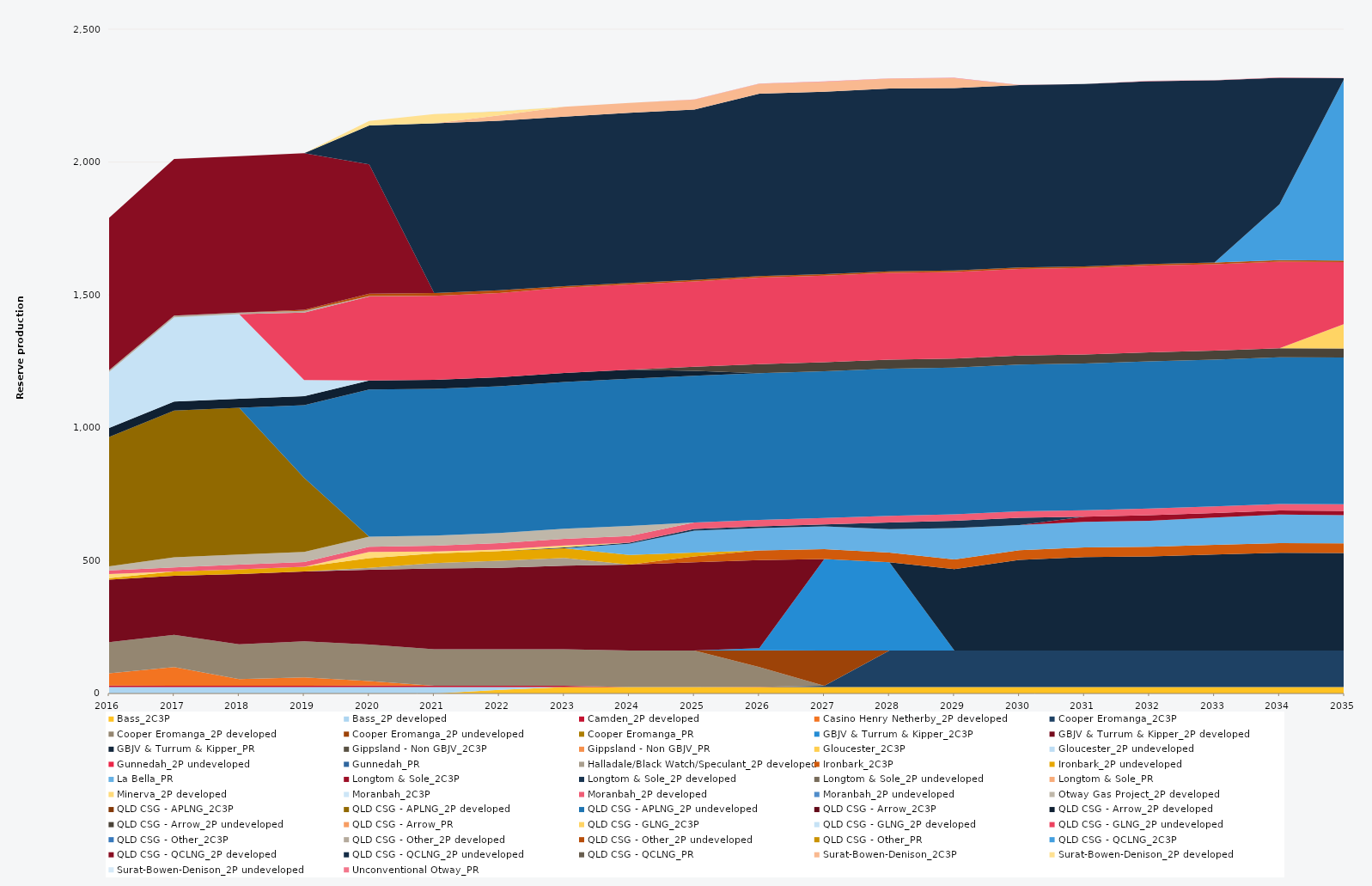
| Category | Bass_2C3P | Bass_2P developed | Camden_2P developed | Casino Henry Netherby_2P developed | Cooper Eromanga_2C3P | Cooper Eromanga_2P developed | Cooper Eromanga_2P undeveloped | Cooper Eromanga_PR | GBJV & Turrum & Kipper_2C3P | GBJV & Turrum & Kipper_2P developed | GBJV & Turrum & Kipper_PR | Gippsland - Non GBJV_2C3P | Gippsland - Non GBJV_PR | Gloucester_2C3P | Gloucester_2P undeveloped | Gunnedah_2P undeveloped | Gunnedah_PR | Halladale/Black Watch/Speculant_2P developed | Ironbark_2C3P | Ironbark_2P undeveloped | La Bella_PR | Longtom & Sole_2C3P | Longtom & Sole_2P developed | Longtom & Sole_2P undeveloped | Longtom & Sole_PR | Minerva_2P developed | Moranbah_2C3P | Moranbah_2P developed | Moranbah_2P undeveloped | Otway Gas Project_2P developed | QLD CSG - APLNG_2C3P | QLD CSG - APLNG_2P developed | QLD CSG - APLNG_2P undeveloped | QLD CSG - Arrow_2C3P | QLD CSG - Arrow_2P developed | QLD CSG - Arrow_2P undeveloped | QLD CSG - Arrow_PR | QLD CSG - GLNG_2C3P | QLD CSG - GLNG_2P developed | QLD CSG - GLNG_2P undeveloped | QLD CSG - Other_2C3P | QLD CSG - Other_2P developed | QLD CSG - Other_2P undeveloped | QLD CSG - Other_PR | QLD CSG - QCLNG_2C3P | QLD CSG - QCLNG_2P developed | QLD CSG - QCLNG_2P undeveloped | QLD CSG - QCLNG_PR | Surat-Bowen-Denison_2C3P | Surat-Bowen-Denison_2P developed | Surat-Bowen-Denison_2P undeveloped | Unconventional Otway_PR |
|---|---|---|---|---|---|---|---|---|---|---|---|---|---|---|---|---|---|---|---|---|---|---|---|---|---|---|---|---|---|---|---|---|---|---|---|---|---|---|---|---|---|---|---|---|---|---|---|---|---|---|---|---|
| 2016 | 0 | 24.522 | 5 | 46.481 | 0 | 117.302 | 0 | 0 | 0 | 235.041 | 0 | 0 | 0 | 0 | 0 | 0 | 0 | 0 | 0 | 5.468 | 0 | 0 | 0 | 0 | 0 | 16 | 0 | 13.144 | 0 | 15.606 | 0 | 486.482 | 0 | 0 | 34.038 | 0 | 0 | 0 | 211.563 | 0 | 0 | 5.856 | 0 | 0 | 0 | 573.742 | 0 | 0 | 0 | 0 | 0 | 0 |
| 2017 | 0 | 24.455 | 5 | 69.931 | 0 | 121.253 | 0 | 0 | 0 | 222.562 | 0 | 0 | 0 | 0 | 0 | 0 | 0 | 0 | 0 | 16.286 | 0 | 0 | 0 | 0 | 0 | 0 | 0 | 14.794 | 0 | 38 | 0 | 552.245 | 0 | 0 | 33.945 | 0 | 0 | 0 | 317.522 | 0 | 0 | 5.84 | 0 | 0 | 0 | 589.569 | 0 | 0 | 0 | 0 | 0 | 0 |
| 2018 | 0 | 24.455 | 5 | 24.61 | 0 | 130.904 | 0 | 0 | 0 | 264.315 | 0 | 0 | 0 | 0 | 0 | 0 | 0 | 0 | 0 | 18.209 | 0 | 0 | 0 | 0 | 0 | 0 | 0 | 17.995 | 0 | 38 | 0 | 552.245 | 0 | 0 | 33.945 | 0 | 0 | 0 | 318.073 | 0 | 0 | 5.84 | 0 | 0 | 0 | 588.744 | 0 | 0 | 0 | 0 | 0 | 0 |
| 2019 | 0 | 24.455 | 5 | 31.568 | 0 | 135.35 | 0 | 0 | 0 | 262.5 | 0 | 0 | 0 | 0 | 0 | 0 | 0 | 0 | 0 | 18.25 | 0 | 0 | 0 | 0 | 0 | 0 | 0 | 18.062 | 0 | 38 | 0 | 278.578 | 273.667 | 0 | 33.945 | 0 | 0 | 0 | 60.142 | 254.295 | 0 | 5.84 | 4.563 | 0 | 0 | 588.948 | 0 | 0 | 0 | 0 | 0 | 0 |
| 2020 | 0 | 24.522 | 5 | 17.669 | 0 | 137.25 | 0 | 0 | 0 | 281.351 | 0 | 0 | 0 | 0 | 0 | 0 | 0 | 6.818 | 0 | 36.6 | 0 | 0 | 0 | 0 | 0 | 23.79 | 0 | 19.632 | 0 | 38 | 0 | 0 | 553.758 | 0 | 34.038 | 0 | 0 | 0 | 0 | 315.784 | 0 | 1.624 | 8.795 | 0 | 0 | 486.398 | 147.06 | 0 | 0 | 16.42 | 0 | 0 |
| 2021 | 0 | 24.455 | 5 | 0 | 0 | 136.875 | 0 | 0 | 0 | 304.277 | 0 | 0 | 0 | 0 | 0 | 0 | 0 | 20.198 | 0 | 36.5 | 0 | 0 | 0 | 0 | 0 | 7.135 | 0 | 22.187 | 0 | 38 | 0 | 0 | 552.245 | 0 | 33.945 | 0 | 0 | 0 | 0 | 315.98 | 0 | 0 | 10.403 | 0 | 0 | 0 | 638.374 | 0 | 0 | 35.153 | 0 | 0 |
| 2022 | 13.672 | 10.783 | 5 | 0 | 0 | 136.875 | 0 | 0 | 0 | 306.648 | 0 | 0 | 0 | 0 | 0 | 0 | 0 | 26.339 | 0 | 36.5 | 0 | 0 | 0 | 0 | 0 | 6.283 | 0 | 24.144 | 0 | 38 | 0 | 0 | 552.245 | 0 | 33.945 | 0 | 0 | 0 | 0 | 316.418 | 0 | 0 | 10.403 | 0 | 0 | 0 | 638.383 | 0 | 19.989 | 15.241 | 2 | 0 |
| 2023 | 24.455 | 0 | 5 | 0 | 0 | 136.875 | 0 | 0 | 0 | 315.098 | 0 | 0 | 0 | 0 | 0 | 0 | 0 | 28.645 | 0 | 36.5 | 0 | 0 | 3.364 | 0 | 0 | 7.541 | 0 | 24.788 | 0 | 38 | 0 | 0 | 552.245 | 0 | 33.945 | 0 | 0 | 0 | 0 | 320.75 | 0 | 0 | 5.84 | 0 | 0 | 0 | 638.041 | 0 | 37.23 | 0 | 0 | 0 |
| 2024 | 24.522 | 0 | 0 | 0 | 0 | 137.25 | 0 | 0 | 0 | 323.245 | 0 | 0 | 0 | 0 | 0 | 0 | 0 | 0 | 0 | 36.6 | 42.142 | 0 | 3.84 | 0 | 0 | 0 | 0 | 24.888 | 0 | 38 | 0 | 0 | 553.758 | 0 | 34.038 | 0 | 0 | 0 | 0 | 321.243 | 0 | 0 | 5.856 | 0 | 0 | 0 | 639.813 | 0 | 37.332 | 0 | 0 | 0 |
| 2025 | 24.455 | 0 | 0 | 0 | 0 | 136.875 | 0 | 0 | 0 | 332.757 | 0 | 0 | 0 | 0 | 0 | 0 | 0 | 0 | 21.413 | 15.087 | 82.203 | 0 | 6.262 | 0 | 0 | 0 | 0 | 24.82 | 0 | 0 | 0 | 0 | 552.245 | 0 | 18.166 | 15.779 | 0 | 0 | 0 | 320.866 | 0 | 0 | 5.84 | 0 | 0 | 0 | 641.133 | 0 | 37.23 | 0 | 0 | 0.854 |
| 2026 | 24.455 | 0 | 1 | 0 | 0 | 74.191 | 62.684 | 0 | 8.223 | 331.313 | 0 | 0 | 0 | 0 | 0 | 0 | 0 | 0 | 36.5 | 0 | 84.04 | 0 | 6.381 | 0 | 0 | 0 | 0 | 24.82 | 0 | 0 | 0 | 0 | 552.245 | 0 | 0 | 33.945 | 0 | 0 | 0 | 325.58 | 0 | 0 | 5.84 | 0 | 0 | 0 | 686.2 | 0 | 37.23 | 0 | 0 | 0.883 |
| 2027 | 24.455 | 0 | 0 | 0 | 4.977 | 0 | 131.898 | 0 | 345.189 | 0 | 0 | 0 | 0 | 0 | 0 | 0 | 0 | 0 | 36.5 | 0 | 86.031 | 0 | 6.937 | 0 | 0 | 0 | 0 | 24.82 | 0 | 0 | 0 | 0 | 552.245 | 0 | 0 | 33.945 | 0 | 0 | 0 | 325.58 | 0 | 0 | 5.84 | 0 | 0 | 0 | 686.2 | 0 | 37.23 | 0 | 0 | 1.497 |
| 2028 | 24.522 | 0 | 0 | 0 | 137.25 | 0 | 0 | 0 | 332.301 | 0 | 0 | 0 | 0 | 0 | 0 | 0 | 0 | 0 | 36.6 | 0 | 88.107 | 0 | 24.931 | 0 | 0 | 0 | 0 | 24.888 | 0 | 0 | 0 | 0 | 553.758 | 0 | 0 | 34.038 | 0 | 0 | 0 | 326.472 | 0 | 0 | 5.856 | 0 | 0 | 0 | 688.08 | 0 | 37.332 | 0 | 0 | 0.878 |
| 2029 | 24.455 | 0 | 0 | 0 | 136.875 | 0 | 0 | 0 | 0 | 0 | 306.869 | 0 | 0 | 0 | 0 | 0 | 0 | 0 | 36.5 | 0 | 117.776 | 0 | 27.375 | 0 | 0 | 0 | 0 | 24.82 | 0 | 0 | 0 | 0 | 552.245 | 0 | 0 | 33.945 | 0 | 0 | 0 | 325.58 | 0 | 0 | 5.84 | 0 | 0 | 0 | 686.2 | 0 | 37.127 | 0 | 0 | 1.495 |
| 2030 | 24.455 | 0 | 0 | 0 | 136.875 | 0 | 0 | 0 | 0 | 0 | 341.19 | 0 | 0 | 0 | 0 | 0 | 0 | 0 | 36.5 | 0 | 94.742 | 0 | 27.375 | 0 | 0 | 0 | 0 | 24.82 | 0 | 0 | 0 | 0 | 552.245 | 0 | 0 | 33.945 | 0 | 0 | 0 | 325.58 | 0 | 0 | 5.84 | 0 | 0 | 0 | 686.2 | 0 | 0 | 0 | 0 | 0.507 |
| 2031 | 24.455 | 0 | 0 | 0 | 136.875 | 0 | 0 | 0 | 0 | 0 | 351.891 | 0 | 0 | 0 | 0 | 0 | 0 | 0 | 36.5 | 0 | 96.446 | 18.939 | 0.018 | 0 | 0 | 0 | 0 | 24.82 | 0 | 0 | 0 | 0 | 552.245 | 0 | 0 | 33.945 | 0 | 0 | 0 | 325.58 | 0 | 0 | 5.84 | 0 | 0 | 0 | 686.2 | 0 | 0 | 0 | 0 | 0.41 |
| 2032 | 24.522 | 0 | 0 | 0 | 137.25 | 0 | 0 | 0 | 0 | 0 | 353.692 | 0 | 0 | 0 | 0 | 0 | 0 | 0 | 36.6 | 0 | 98.152 | 21.12 | 0 | 0 | 0 | 0 | 0 | 24.888 | 0 | 0 | 0 | 0 | 553.758 | 0 | 0 | 34.038 | 0 | 0 | 0 | 326.472 | 0 | 0 | 5.856 | 0 | 0 | 0 | 688.08 | 0 | 0 | 0 | 0 | 1.258 |
| 2033 | 24.455 | 0 | 0 | 0 | 136.875 | 0 | 0 | 0 | 0 | 0 | 361.413 | 0 | 0 | 0 | 0 | 0 | 0 | 0 | 36.5 | 0 | 103.278 | 16.645 | 0 | 0 | 0 | 0 | 0 | 24.82 | 0 | 0 | 0 | 0 | 552.245 | 0 | 0 | 33.945 | 0 | 0 | 0 | 325.58 | 0 | 0 | 5.84 | 0 | 0 | 0 | 686.2 | 0 | 0 | 0 | 0 | 0.957 |
| 2034 | 24.455 | 0 | 0 | 0 | 136.875 | 0 | 0 | 0 | 0 | 0 | 368.025 | 0 | 0 | 0 | 0 | 0 | 0 | 0 | 36.5 | 0 | 107.761 | 15.064 | 0 | 0 | 0 | 0 | 0 | 24.82 | 0 | 0 | 0 | 0 | 552.245 | 0 | 0 | 33.945 | 0 | 0 | 0 | 325.58 | 0 | 0 | 5.84 | 0 | 210.318 | 0 | 475.882 | 0 | 0 | 0 | 0 | 1.243 |
| 2035 | 24.455 | 0 | 0 | 0 | 136.875 | 0 | 0 | 0 | 0 | 0 | 367.134 | 0 | 0 | 0 | 0 | 0 | 0 | 0 | 36.5 | 0 | 106.322 | 15.791 | 0 | 0 | 0 | 0 | 0 | 24.82 | 0 | 0 | 0 | 0 | 552.245 | 0 | 0 | 33.945 | 0 | 92.859 | 0 | 232.721 | 0 | 0 | 5.84 | 0 | 686.2 | 0 | 0 | 0 | 0 | 0 | 0 | 1.018 |